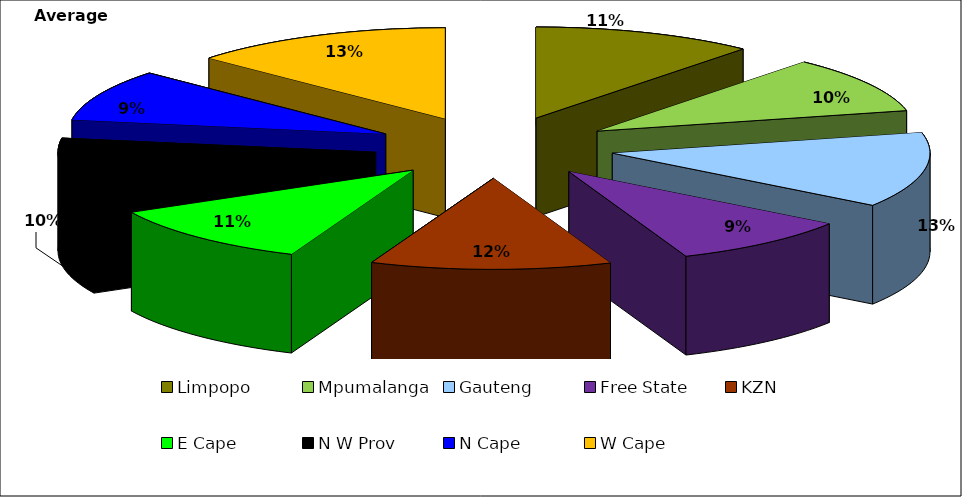
| Category | Average 1996 |
|---|---|
| Limpopo | 162730.875 |
| Mpumalanga | 145293.3 |
| Gauteng | 192059.3 |
| Free State | 133658.4 |
| KZN | 176761.675 |
| E Cape | 159762.125 |
| N W Prov | 146049.2 |
| N Cape | 131930.05 |
| W Cape | 192415.975 |